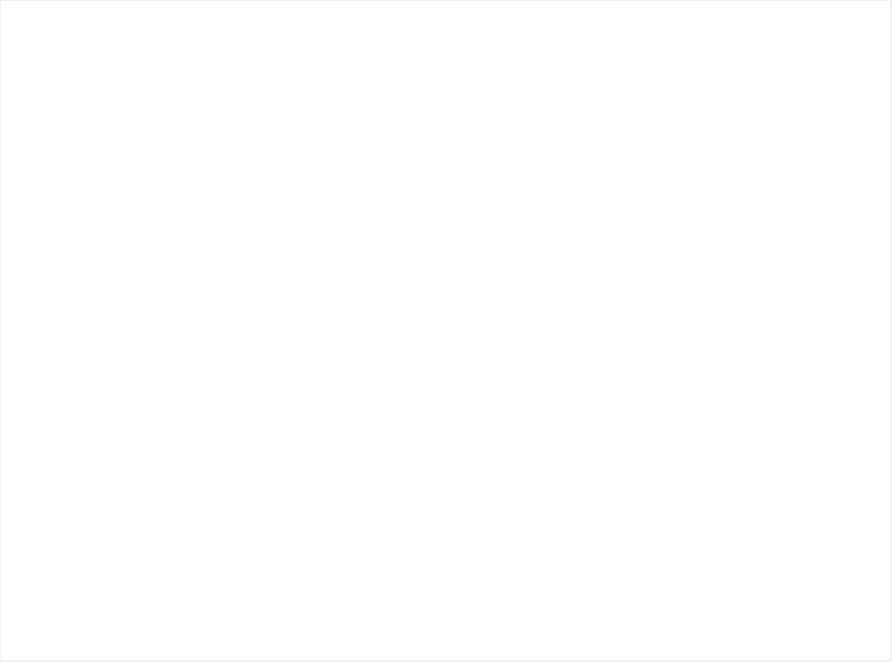
| Category |   Total PoP  | # of People adopt basic personal and community hygiene practices | # of people access to functioning  sanitation facilities | # of people Equitable and continuous access to sufficient quantity of domestic water |
|---|---|---|---|---|
| 2020_Q1 | 14096 | 1275 | 2529 | 0 |
| 2020_Q2 | 5926 | 1044 | 2394 | 3054 |